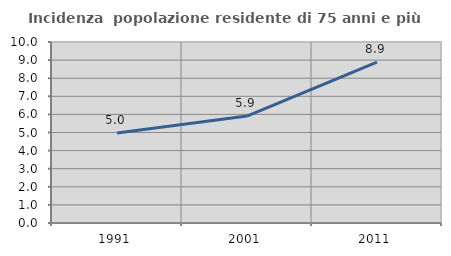
| Category | Incidenza  popolazione residente di 75 anni e più |
|---|---|
| 1991.0 | 4.967 |
| 2001.0 | 5.906 |
| 2011.0 | 8.893 |